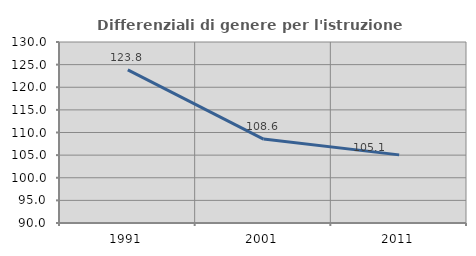
| Category | Differenziali di genere per l'istruzione superiore |
|---|---|
| 1991.0 | 123.821 |
| 2001.0 | 108.555 |
| 2011.0 | 105.054 |